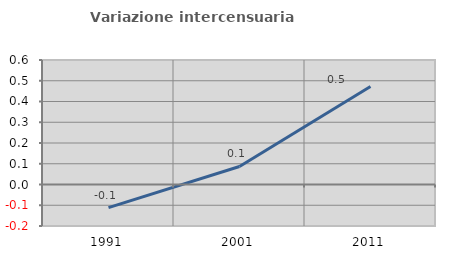
| Category | Variazione intercensuaria annua |
|---|---|
| 1991.0 | -0.112 |
| 2001.0 | 0.087 |
| 2011.0 | 0.472 |